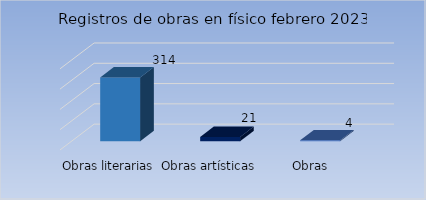
| Category | Cantidad |
|---|---|
| Obras literarias | 314 |
| Obras artísticas | 21 |
| Obras cientificas | 4 |